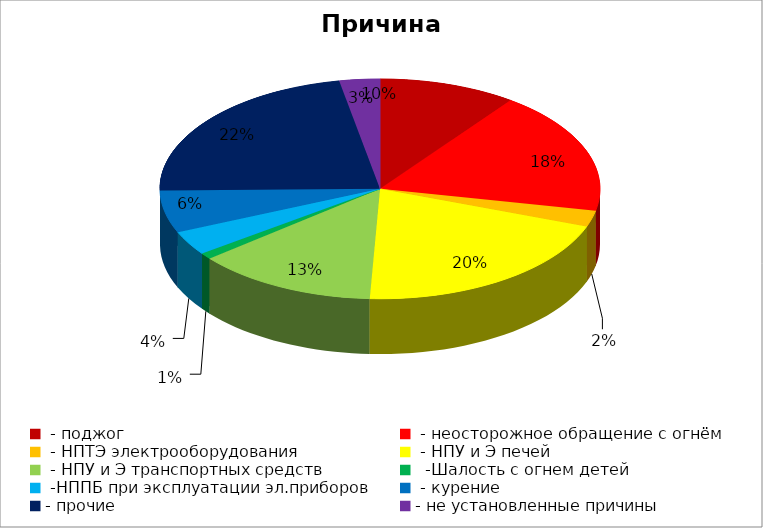
| Category | Причина пожара |
|---|---|
|  - поджог | 34 |
|  - неосторожное обращение с огнём | 61 |
|  - НПТЭ электрооборудования | 8 |
|  - НПУ и Э печей | 68 |
|  - НПУ и Э транспортных средств | 45 |
|   -Шалость с огнем детей | 3 |
|  -НППБ при эксплуатации эл.приборов | 12 |
|  - курение | 21 |
| - прочие | 75 |
| - не установленные причины | 10 |